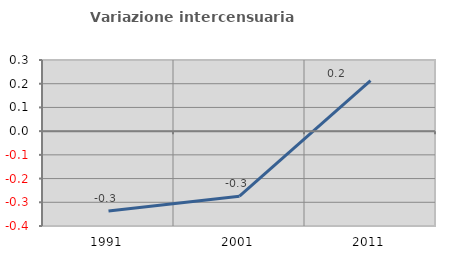
| Category | Variazione intercensuaria annua |
|---|---|
| 1991.0 | -0.337 |
| 2001.0 | -0.275 |
| 2011.0 | 0.213 |